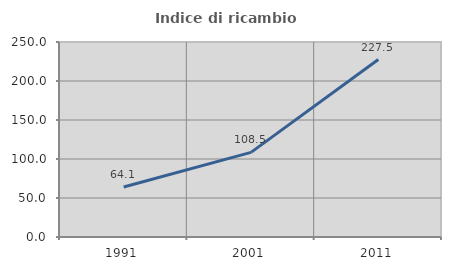
| Category | Indice di ricambio occupazionale  |
|---|---|
| 1991.0 | 64.086 |
| 2001.0 | 108.511 |
| 2011.0 | 227.5 |